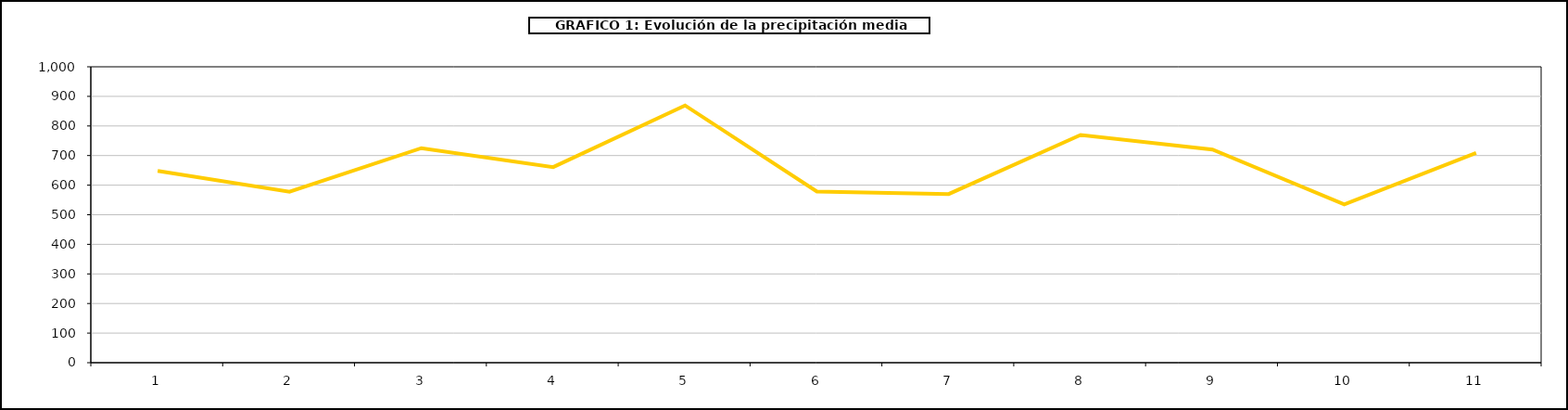
| Category | Series 0 |
|---|---|
| 0 | 648 |
| 1 | 578 |
| 2 | 725 |
| 3 | 661 |
| 4 | 869.377 |
| 5 | 578.444 |
| 6 | 570.087 |
| 7 | 769.551 |
| 8 | 720.348 |
| 9 | 535.081 |
| 10 | 709 |